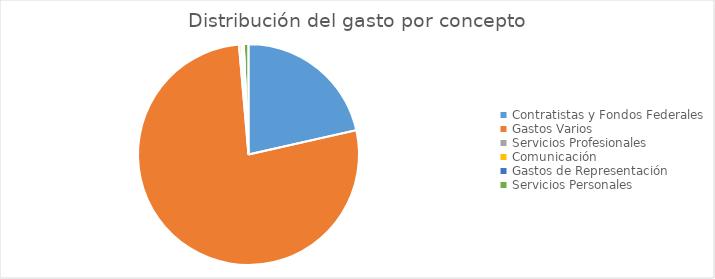
| Category | Series 0 |
|---|---|
| Contratistas y Fondos Federales | 131078335 |
| Gastos Varios | 471248216.07 |
| Servicios Profesionales | 2181487.28 |
| Comunicación | 2027661.09 |
| Gastos de Representación | 59037.45 |
| Servicios Personales | 4184650.68 |